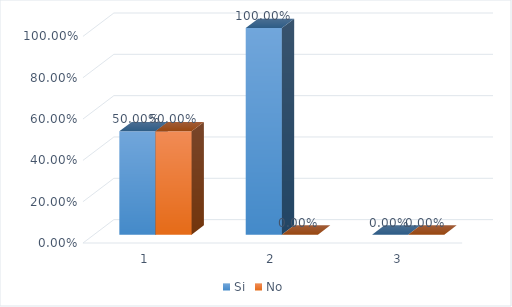
| Category | Si | No |
|---|---|---|
| 0 | 0.5 | 0.5 |
| 1 | 1 | 0 |
| 2 | 0 | 0 |